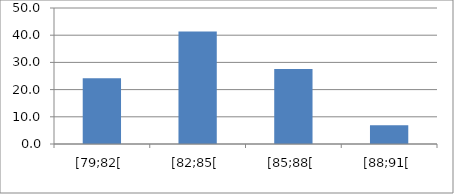
| Category | Series 0 |
|---|---|
| [79;82[ | 24.138 |
| [82;85[ | 41.379 |
| [85;88[ | 27.586 |
| [88;91[ | 6.897 |